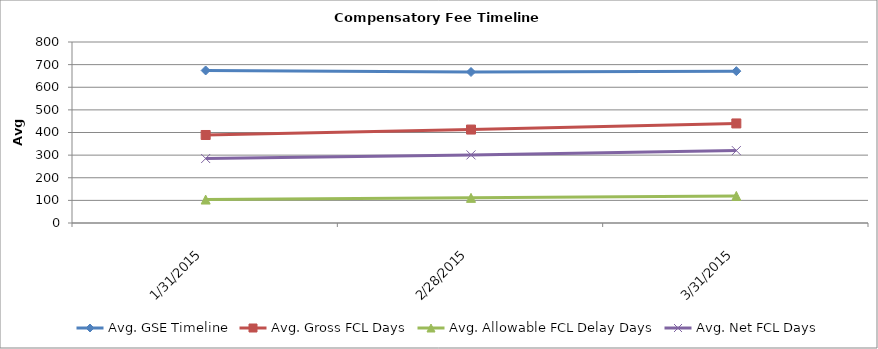
| Category | Avg. GSE Timeline | Avg. Gross FCL Days | Avg. Allowable FCL Delay Days | Avg. Net FCL Days |
|---|---|---|---|---|
| 1/31/15 | 674.145 | 389 | 103.6 | 285 |
| 2/28/15 | 667.437 | 413 | 111.1 | 301 |
| 3/31/15 | 671.158 | 440 | 119.65 | 320 |